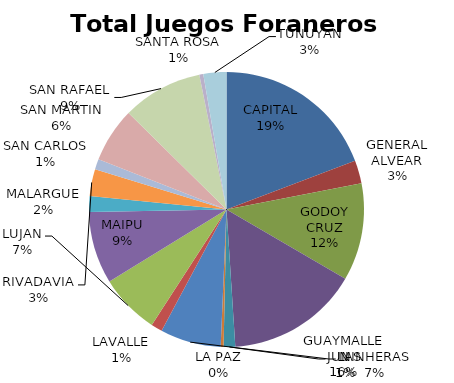
| Category | Total Juegos Foraneros Beneficio |
|---|---|
| CAPITAL | 721480.25 |
| GENERAL ALVEAR | 102258.08 |
| GODOY CRUZ | 429672.44 |
| GUAYMALLEN | 584310.29 |
| JUNIN | 51035.78 |
| LA PAZ | 12733.18 |
| LAS HERAS | 268102.38 |
| LAVALLE | 49686.38 |
| LUJAN | 265508.78 |
| MAIPU | 318616.38 |
| MALARGUE | 69100.22 |
| RIVADAVIA | 119525.05 |
| SAN CARLOS | 45171.61 |
| SAN MARTIN | 241400.45 |
| SAN RAFAEL  | 354473.61 |
| SANTA ROSA | 17560.81 |
| TUNUYAN | 101494.02 |